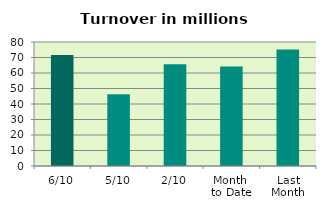
| Category | Series 0 |
|---|---|
| 6/10 | 71.681 |
| 5/10 | 46.352 |
| 2/10 | 65.724 |
| Month 
to Date | 64.225 |
| Last
Month | 75.235 |